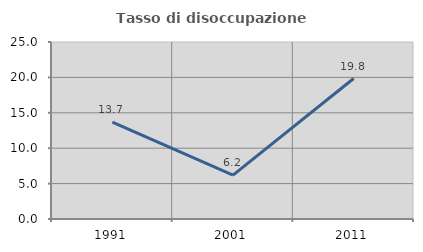
| Category | Tasso di disoccupazione giovanile  |
|---|---|
| 1991.0 | 13.699 |
| 2001.0 | 6.202 |
| 2011.0 | 19.841 |